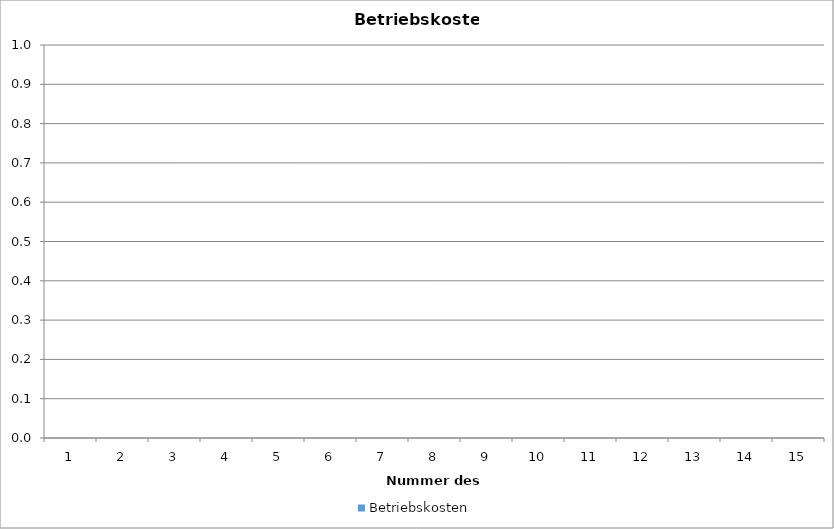
| Category | Betriebskosten |
|---|---|
| 0 | 0 |
| 1 | 0 |
| 2 | 0 |
| 3 | 0 |
| 4 | 0 |
| 5 | 0 |
| 6 | 0 |
| 7 | 0 |
| 8 | 0 |
| 9 | 0 |
| 10 | 0 |
| 11 | 0 |
| 12 | 0 |
| 13 | 0 |
| 14 | 0 |